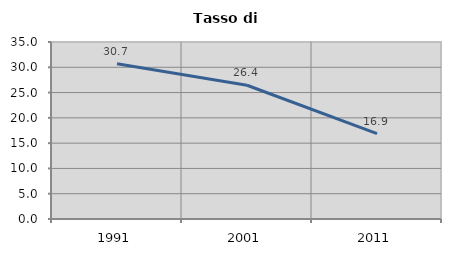
| Category | Tasso di disoccupazione   |
|---|---|
| 1991.0 | 30.716 |
| 2001.0 | 26.448 |
| 2011.0 | 16.888 |